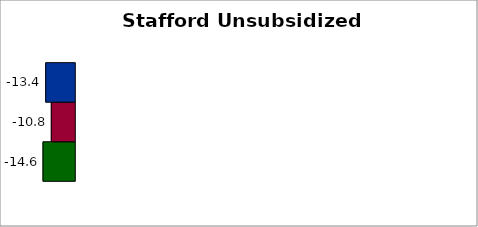
| Category | State | SREB states | 50 states and D.C. |
|---|---|---|---|
| 0 | -14.636 | -10.815 | -13.387 |